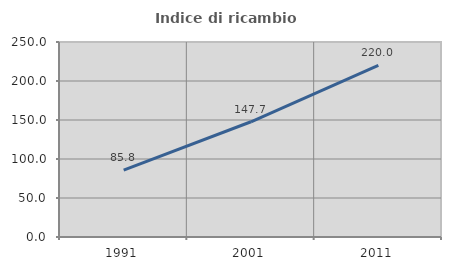
| Category | Indice di ricambio occupazionale  |
|---|---|
| 1991.0 | 85.841 |
| 2001.0 | 147.727 |
| 2011.0 | 220 |